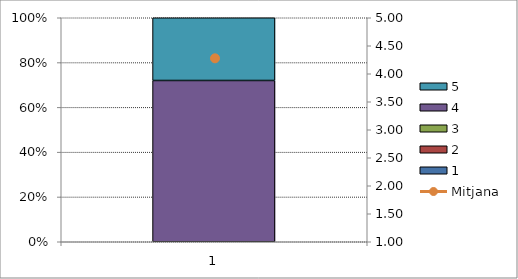
| Category | 1 | 2 | 3 | 4 | 5 |
|---|---|---|---|---|---|
| 0 | 0 | 0 | 0 | 18 | 7 |